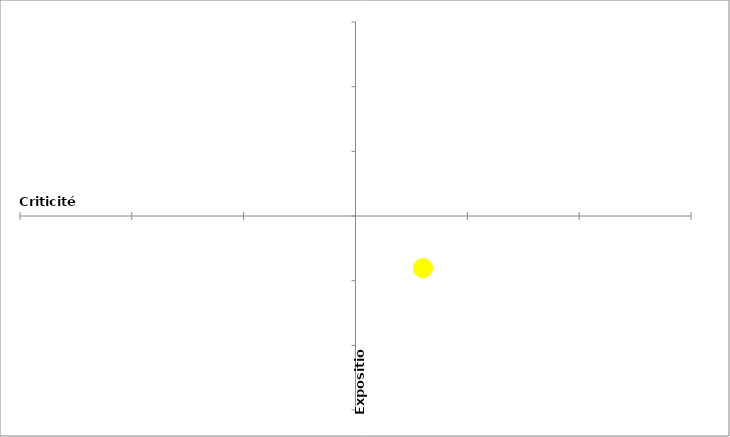
| Category | Catégorisation du SI |
|---|---|
| 6.0 | -8 |